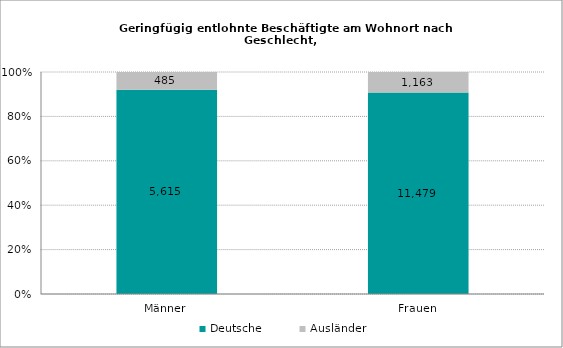
| Category | Deutsche | Ausländer |
|---|---|---|
| Männer | 5615 | 485 |
| Frauen | 11479 | 1163 |